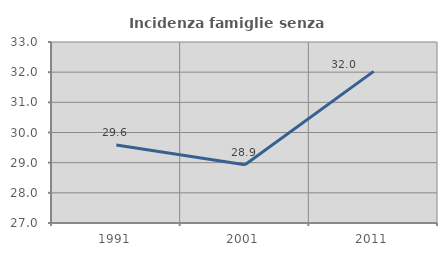
| Category | Incidenza famiglie senza nuclei |
|---|---|
| 1991.0 | 29.586 |
| 2001.0 | 28.931 |
| 2011.0 | 32.026 |